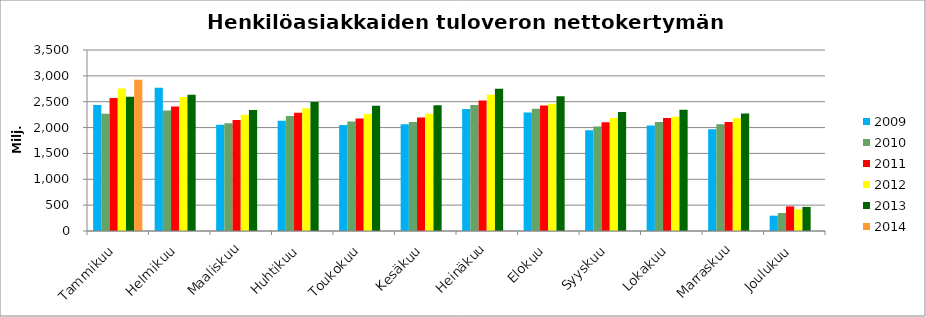
| Category | 2009 | 2010 | 2011 | 2012 | 2013 | 2014 |
|---|---|---|---|---|---|---|
| Tammikuu | 2438.489 | 2267.873 | 2569.442 | 2754.468 | 2597.268 | 2923.115 |
| Helmikuu | 2771.607 | 2330.409 | 2406.04 | 2591.616 | 2636.607 | 0 |
| Maaliskuu | 2054.852 | 2084.249 | 2145.291 | 2250.057 | 2340.316 | 0 |
| Huhtikuu | 2131.066 | 2225.487 | 2285.914 | 2375.631 | 2492.368 | 0 |
| Toukokuu | 2051.558 | 2117.095 | 2177.688 | 2264.689 | 2423.516 | 0 |
| Kesäkuu | 2063.182 | 2109.339 | 2194.481 | 2268.001 | 2432.777 | 0 |
| Heinäkuu | 2357.008 | 2435.026 | 2524.383 | 2633.57 | 2750.145 | 0 |
| Elokuu | 2289.863 | 2364.596 | 2427.052 | 2461.949 | 2607.529 | 0 |
| Syyskuu | 1946.167 | 2019.118 | 2102.001 | 2184.152 | 2299.363 | 0 |
| Lokakuu | 2041.676 | 2107.95 | 2185.045 | 2211.144 | 2342.648 | 0 |
| Marraskuu | 1967.798 | 2063.457 | 2106.752 | 2183.43 | 2270.307 | 0 |
| Joulukuu | 296.354 | 347.927 | 476.484 | 421.857 | 466.039 | 0 |